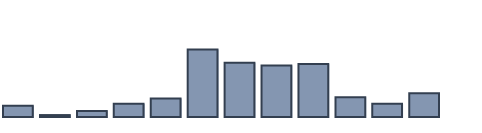
| Category | Series 0 |
|---|---|
| 0 | 3.352 |
| 1 | 0.578 |
| 2 | 1.829 |
| 3 | 3.938 |
| 4 | 5.567 |
| 5 | 20.208 |
| 6 | 16.263 |
| 7 | 15.432 |
| 8 | 15.861 |
| 9 | 5.942 |
| 10 | 3.948 |
| 11 | 7.083 |
| 12 | 0 |